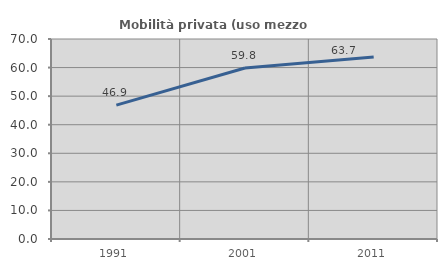
| Category | Mobilità privata (uso mezzo privato) |
|---|---|
| 1991.0 | 46.863 |
| 2001.0 | 59.845 |
| 2011.0 | 63.666 |